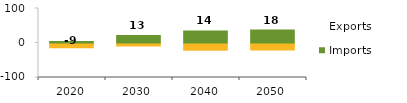
| Category | Exports | Imports |
|---|---|---|
| 2020.0 | -9.457 | 4.263 |
| 2030.0 | 13.168 | 21.912 |
| 2040.0 | 14.029 | 34.888 |
| 2050.0 | 17.779 | 37.74 |